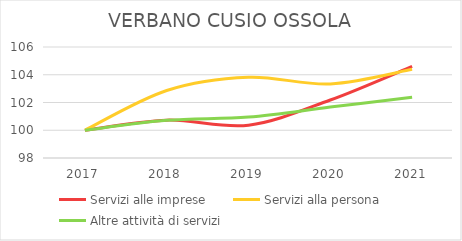
| Category | Servizi alle imprese | Servizi alla persona | Altre attività di servizi |
|---|---|---|---|
| 2017.0 | 100 | 100 | 100 |
| 2018.0 | 100.727 | 102.863 | 100.715 |
| 2019.0 | 100.364 | 103.817 | 100.953 |
| 2020.0 | 102.182 | 103.34 | 101.668 |
| 2021.0 | 104.606 | 104.389 | 102.382 |